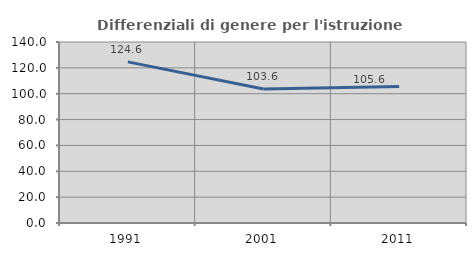
| Category | Differenziali di genere per l'istruzione superiore |
|---|---|
| 1991.0 | 124.615 |
| 2001.0 | 103.585 |
| 2011.0 | 105.605 |